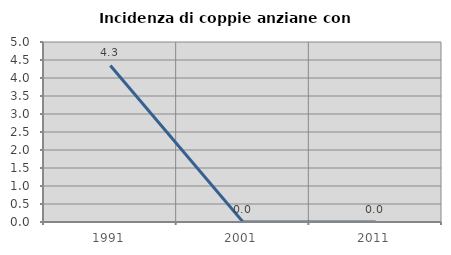
| Category | Incidenza di coppie anziane con figli |
|---|---|
| 1991.0 | 4.348 |
| 2001.0 | 0 |
| 2011.0 | 0 |